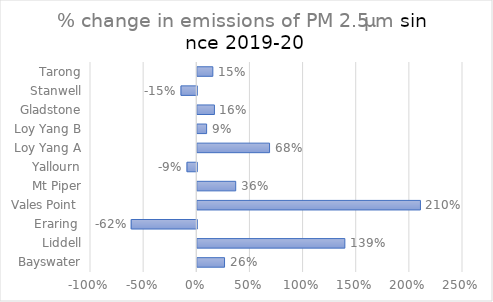
| Category | PM 2.5μm |
|---|---|
| Bayswater | 0.256 |
| Liddell | 1.388 |
|  Eraring  | -0.617 |
| Vales Point  | 2.1 |
| Mt Piper | 0.361 |
| Yallourn | -0.092 |
| Loy Yang A | 0.68 |
| Loy Yang B | 0.088 |
| Gladstone | 0.161 |
| Stanwell | -0.149 |
| Tarong | 0.146 |